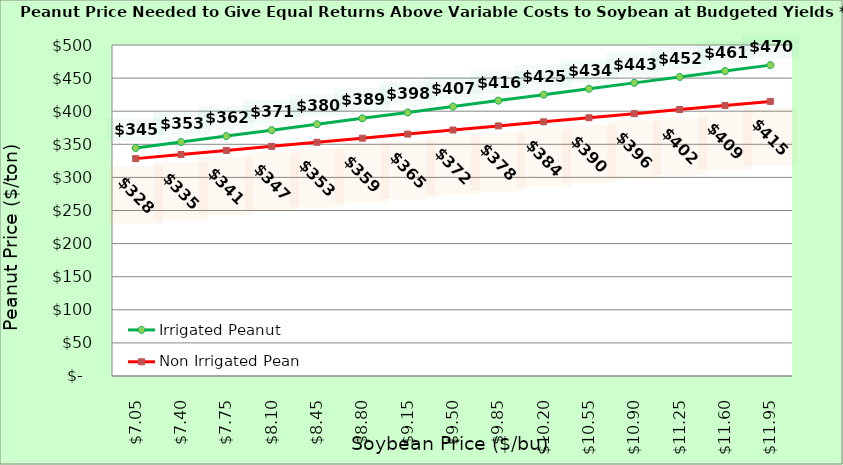
| Category | Irrigated Peanut | Non Irrigated Peanut |
|---|---|---|
| 7.0500000000000025 | 344.507 | 328.358 |
| 7.400000000000002 | 353.443 | 334.535 |
| 7.750000000000002 | 362.379 | 340.711 |
| 8.100000000000001 | 371.316 | 346.888 |
| 8.450000000000001 | 380.252 | 353.064 |
| 8.8 | 389.188 | 359.241 |
| 9.15 | 398.124 | 365.417 |
| 9.5 | 407.06 | 371.594 |
| 9.85 | 415.996 | 377.77 |
| 10.2 | 424.933 | 383.947 |
| 10.549999999999999 | 433.869 | 390.123 |
| 10.899999999999999 | 442.805 | 396.3 |
| 11.249999999999998 | 451.741 | 402.476 |
| 11.599999999999998 | 460.677 | 408.652 |
| 11.949999999999998 | 469.613 | 414.829 |